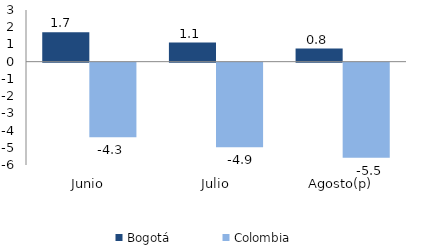
| Category | Bogotá | Colombia |
|---|---|---|
| Junio | 1.703 | -4.332 |
| Julio | 1.107 | -4.909 |
| Agosto(p) | 0.759 | -5.526 |